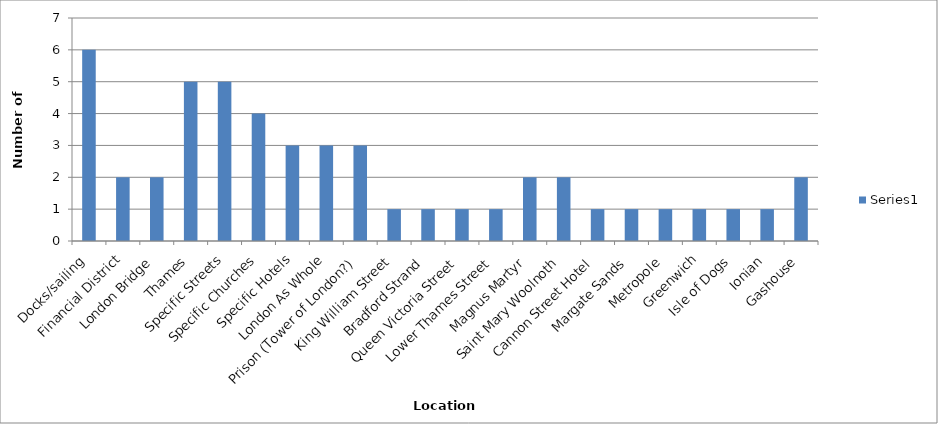
| Category | Series 0 |
|---|---|
| Docks/sailing | 6 |
| Financial District | 2 |
| London Bridge | 2 |
| Thames | 5 |
| Specific Streets | 5 |
| Specific Churches | 4 |
| Specific Hotels | 3 |
| London As Whole | 3 |
| Prison (Tower of London?) | 3 |
| King William Street | 1 |
| Bradford Strand | 1 |
| Queen Victoria Street | 1 |
| Lower Thames Street | 1 |
| Magnus Martyr | 2 |
| Saint Mary Woolnoth | 2 |
| Cannon Street Hotel | 1 |
| Margate Sands | 1 |
| Metropole | 1 |
| Greenwich | 1 |
| Isle of Dogs | 1 |
| Ionian | 1 |
| Gashouse | 2 |